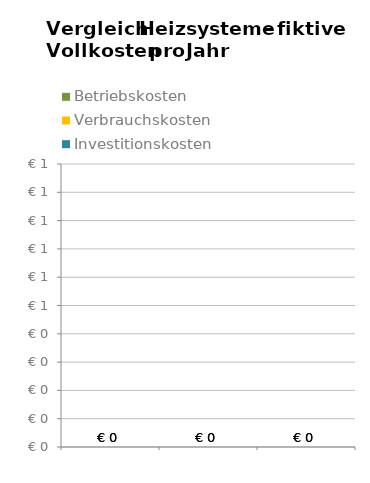
| Category | Investitionskosten | Verbrauchskosten | Betriebskosten |
|---|---|---|---|
| 0 | 0 | 0 | 0 |
| 1 | 0 | 0 | 0 |
| 2 | 0 | 0 | 0 |